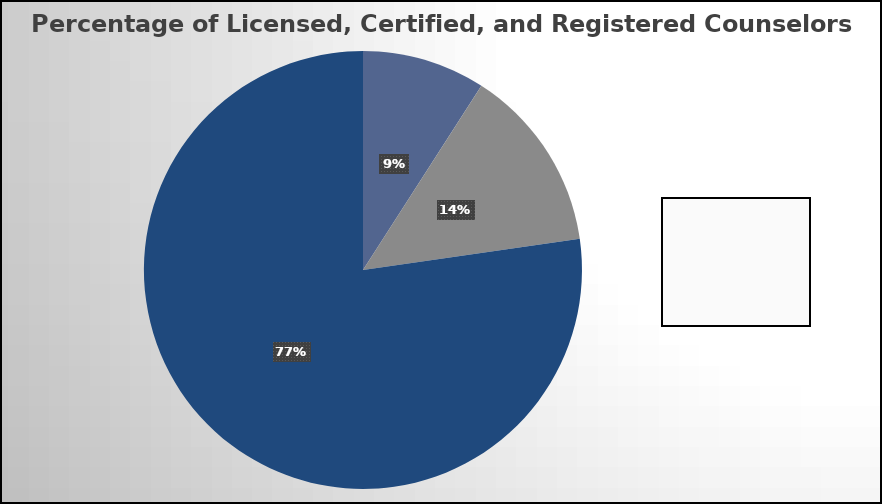
| Category | Series 0 |
|---|---|
| Licensed | 2 |
| Certified | 3 |
| Registered | 17 |